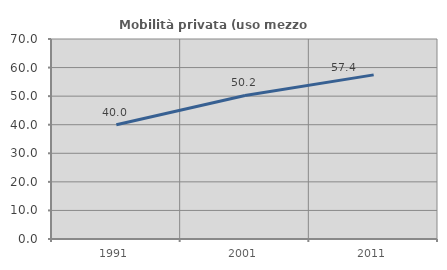
| Category | Mobilità privata (uso mezzo privato) |
|---|---|
| 1991.0 | 40 |
| 2001.0 | 50.228 |
| 2011.0 | 57.438 |